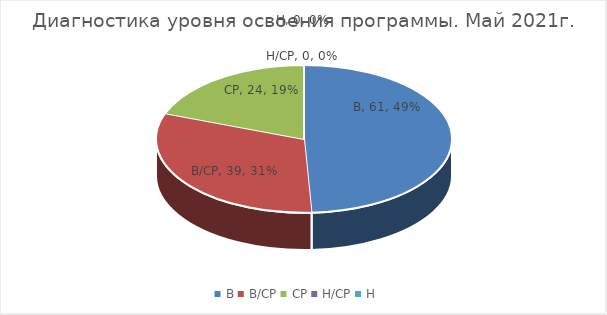
| Category | Series 0 |
|---|---|
| В | 61 |
| В/СР | 39 |
| СР | 24 |
| Н/СР | 0 |
| Н | 0 |